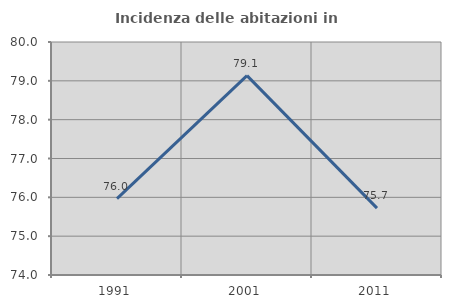
| Category | Incidenza delle abitazioni in proprietà  |
|---|---|
| 1991.0 | 75.966 |
| 2001.0 | 79.134 |
| 2011.0 | 75.723 |